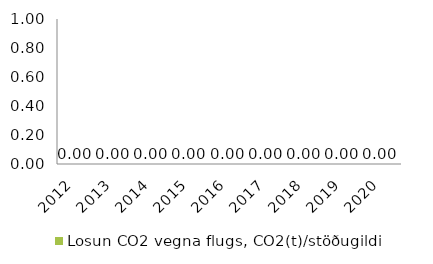
| Category | Losun CO2 vegna flugs, CO2(t)/stöðugildi |
|---|---|
| 2012.0 | 0 |
| 2013.0 | 0 |
| 2014.0 | 0 |
| 2015.0 | 0 |
| 2016.0 | 0 |
| 2017.0 | 0 |
| 2018.0 | 0 |
| 2019.0 | 0 |
| 2020.0 | 0 |